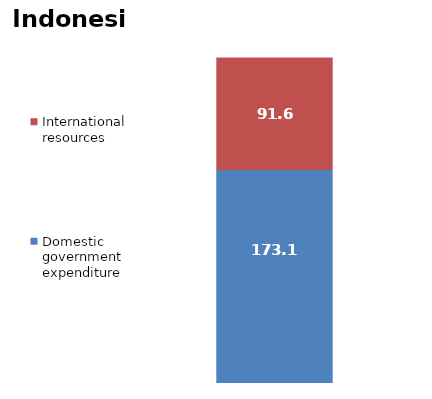
| Category | Domestic government expenditure | International resources |
|---|---|---|
| 0 | 173.12 | 91.561 |